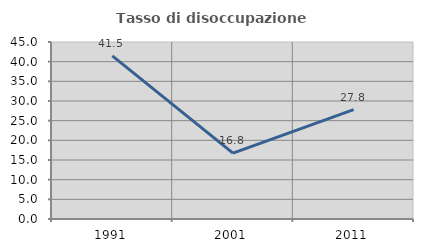
| Category | Tasso di disoccupazione giovanile  |
|---|---|
| 1991.0 | 41.493 |
| 2001.0 | 16.754 |
| 2011.0 | 27.807 |